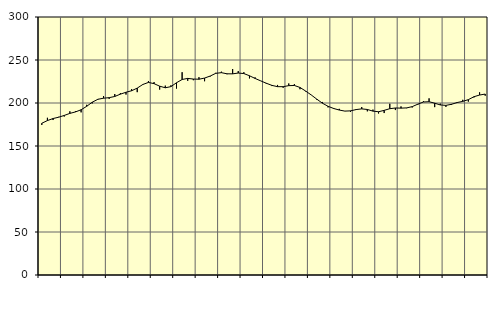
| Category | Piggar | Series 1 |
|---|---|---|
| nan | 174.5 | 176.45 |
| 1.0 | 182.8 | 179.55 |
| 1.0 | 180.2 | 181.93 |
| 1.0 | 183.9 | 183.47 |
| nan | 184.3 | 185.55 |
| 2.0 | 190.3 | 187.91 |
| 2.0 | 190.5 | 189.64 |
| 2.0 | 189.1 | 192.12 |
| nan | 197.9 | 196.16 |
| 3.0 | 199.6 | 200.98 |
| 3.0 | 204.7 | 204.34 |
| 3.0 | 208.1 | 205.59 |
| nan | 204.8 | 206.2 |
| 4.0 | 210.4 | 207.58 |
| 4.0 | 211.5 | 210.27 |
| 4.0 | 209.8 | 212.49 |
| nan | 216.1 | 214.24 |
| 5.0 | 212.6 | 217.3 |
| 5.0 | 221.9 | 221.53 |
| 5.0 | 225.5 | 223.92 |
| nan | 224.3 | 222.5 |
| 6.0 | 215.6 | 219.56 |
| 6.0 | 220.2 | 217.68 |
| 6.0 | 220.5 | 219.04 |
| nan | 216.8 | 223.55 |
| 7.0 | 235.8 | 227.33 |
| 7.0 | 225.8 | 228.6 |
| 7.0 | 226.5 | 227.85 |
| nan | 230 | 227.65 |
| 8.0 | 225.3 | 228.98 |
| 8.0 | 230.8 | 231.34 |
| 8.0 | 235.1 | 234.51 |
| nan | 236.4 | 235.26 |
| 9.0 | 233.5 | 233.95 |
| 9.0 | 239.5 | 233.89 |
| 9.0 | 237.1 | 234.84 |
| nan | 235.8 | 234.24 |
| 10.0 | 228.6 | 231.67 |
| 10.0 | 229.8 | 228.56 |
| 10.0 | 225.6 | 225.73 |
| nan | 222.3 | 222.98 |
| 11.0 | 219.7 | 220.48 |
| 11.0 | 221 | 218.99 |
| 11.0 | 217.7 | 218.97 |
| nan | 222.7 | 220.18 |
| 12.0 | 221.9 | 220.38 |
| 12.0 | 216 | 218.07 |
| 12.0 | 213.5 | 213.95 |
| nan | 209.3 | 209.37 |
| 13.0 | 203.7 | 204.46 |
| 13.0 | 201.2 | 199.74 |
| 13.0 | 194.9 | 196.17 |
| nan | 194.2 | 193.62 |
| 14.0 | 193.2 | 191.8 |
| 14.0 | 190.5 | 190.58 |
| 14.0 | 189.6 | 190.85 |
| nan | 192.8 | 192.36 |
| 15.0 | 195.3 | 193.16 |
| 15.0 | 190.3 | 192.49 |
| 15.0 | 192.3 | 190.55 |
| nan | 187.8 | 189.82 |
| 16.0 | 188.3 | 191.46 |
| 16.0 | 199.1 | 193.37 |
| 16.0 | 191.8 | 194.19 |
| nan | 196 | 194.03 |
| 17.0 | 194 | 194.31 |
| 17.0 | 194.8 | 195.78 |
| 17.0 | 198 | 198.67 |
| nan | 202.1 | 201.18 |
| 18.0 | 205.4 | 201.48 |
| 18.0 | 195.2 | 199.78 |
| 18.0 | 199.2 | 197.73 |
| nan | 195.5 | 197.24 |
| 19.0 | 197.8 | 198.5 |
| 19.0 | 201.1 | 200.53 |
| 19.0 | 203.7 | 201.88 |
| nan | 201.6 | 203.89 |
| 20.0 | 206.5 | 207.31 |
| 20.0 | 212.4 | 209.26 |
| 20.0 | 208.5 | 210.38 |